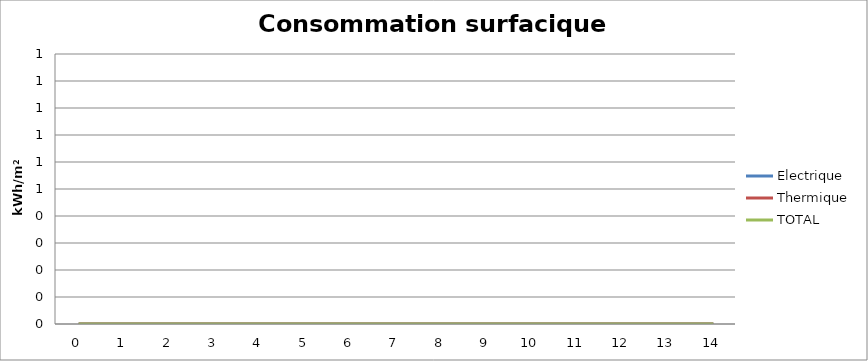
| Category | Electrique | Thermique | TOTAL |
|---|---|---|---|
| 0.0 | 0 | 0 | 0 |
| 1.0 | 0 | 0 | 0 |
| 2.0 | 0 | 0 | 0 |
| 3.0 | 0 | 0 | 0 |
| 4.0 | 0 | 0 | 0 |
| 5.0 | 0 | 0 | 0 |
| 6.0 | 0 | 0 | 0 |
| 7.0 | 0 | 0 | 0 |
| 8.0 | 0 | 0 | 0 |
| 9.0 | 0 | 0 | 0 |
| 10.0 | 0 | 0 | 0 |
| 11.0 | 0 | 0 | 0 |
| 12.0 | 0 | 0 | 0 |
| 13.0 | 0 | 0 | 0 |
| 14.0 | 0 | 0 | 0 |